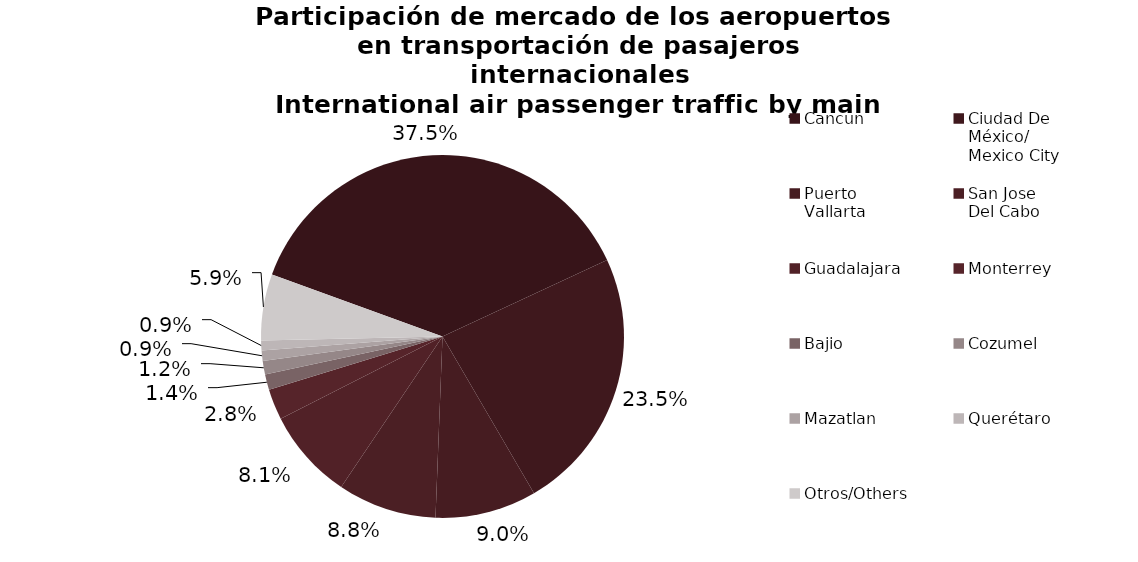
| Category | Series 0 |
|---|---|
| Cancun | 2293.646 |
| Ciudad De 
México/
Mexico City | 1437.728 |
| Puerto 
Vallarta | 551.651 |
| San Jose 
Del Cabo | 538.642 |
| Guadalajara | 494.776 |
| Monterrey | 167.258 |
| Bajio | 84.787 |
| Cozumel | 73.65 |
| Mazatlan | 56.69 |
| Querétaro | 53.387 |
| Otros/Others | 361.3 |